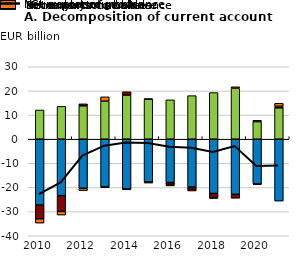
| Category | Net exports of goods | Net exports of services | Primary income balance | Secondary income balance |
|---|---|---|---|---|
| 2010-01-01 | -27.271 | 12.096 | -5.712 | -1.764 |
| 2011-01-01 | -23.391 | 13.594 | -6.525 | -1.508 |
| 2012-01-01 | -20.351 | 13.822 | 0.82 | -0.953 |
| 2013-01-01 | -19.672 | 15.745 | -0.458 | 1.797 |
| 2014-01-01 | -20.631 | 18.244 | 1.401 | -0.334 |
| 2015-01-01 | -17.665 | 16.582 | 0.154 | -0.508 |
| 2016-01-01 | -17.96 | 16.298 | -0.799 | -0.589 |
| 2017-01-01 | -19.834 | 18.042 | -1.056 | -0.558 |
| 2018-01-01 | -22.488 | 19.305 | -1.726 | -0.322 |
| 2019-01-01 | -22.834 | 21.115 | -1.592 | 0.584 |
| 2020-01-01 | -18.529 | 7.278 | -0.277 | 0.562 |
| 2021-01-01 | -25.624 | 12.99 | 0.644 | 1.235 |